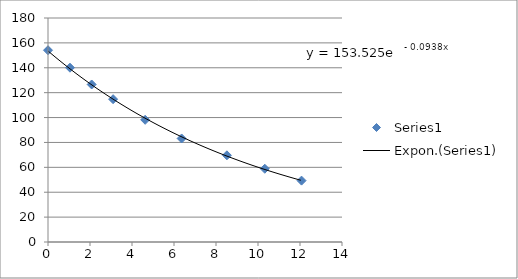
| Category | Series 0 |
|---|---|
| 0.0 | 154.105 |
| 1.0466666666666666 | 140.07 |
| 2.08 | 126.57 |
| 3.0999999999999996 | 114.77 |
| 4.626666666666666 | 98.175 |
| 6.363333333333332 | 83.19 |
| 8.52 | 69.655 |
| 10.323333333333332 | 58.87 |
| 12.073333333333332 | 49.33 |